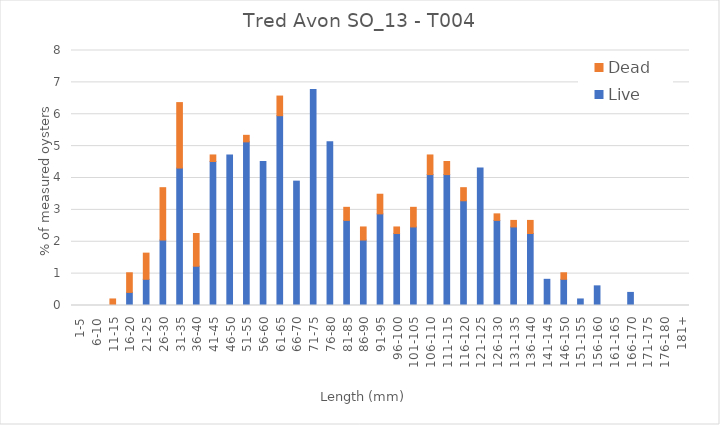
| Category | Live | Dead |
|---|---|---|
| 1-5 | 0 | 0 |
| 6-10 | 0 | 0 |
| 11-15 | 0 | 0.205 |
| 16-20 | 0.411 | 0.616 |
| 21-25 | 0.821 | 0.821 |
| 26-30 | 2.053 | 1.643 |
| 31-35 | 4.312 | 2.053 |
| 36-40 | 1.232 | 1.027 |
| 41-45 | 4.517 | 0.205 |
| 46-50 | 4.723 | 0 |
| 51-55 | 5.133 | 0.205 |
| 56-60 | 4.517 | 0 |
| 61-65 | 5.955 | 0.616 |
| 66-70 | 3.901 | 0 |
| 71-75 | 6.776 | 0 |
| 76-80 | 5.133 | 0 |
| 81-85 | 2.669 | 0.411 |
| 86-90 | 2.053 | 0.411 |
| 91-95 | 2.875 | 0.616 |
| 96-100 | 2.259 | 0.205 |
| 101-105 | 2.464 | 0.616 |
| 106-110 | 4.107 | 0.616 |
| 111-115 | 4.107 | 0.411 |
| 116-120 | 3.285 | 0.411 |
| 121-125 | 4.312 | 0 |
| 126-130 | 2.669 | 0.205 |
| 131-135 | 2.464 | 0.205 |
| 136-140 | 2.259 | 0.411 |
| 141-145 | 0.821 | 0 |
| 146-150 | 0.821 | 0.205 |
| 151-155 | 0.205 | 0 |
| 156-160 | 0.616 | 0 |
| 161-165 | 0 | 0 |
| 166-170 | 0.411 | 0 |
| 171-175 | 0 | 0 |
| 176-180 | 0 | 0 |
| 181+ | 0 | 0 |